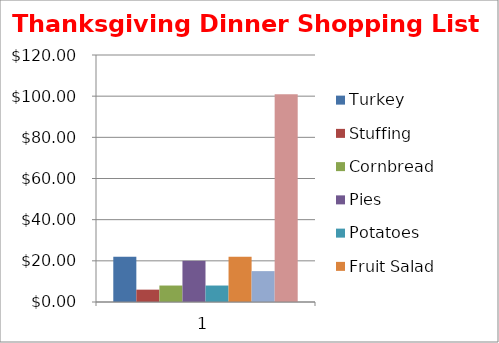
| Category | Turkey | Stuffing | Cornbread | Pies | Potatoes | Fruit Salad | French Coffee | Total Shopping Bill |
|---|---|---|---|---|---|---|---|---|
| 0 | 21.99 | 6 | 8 | 20 | 8 | 22 | 15 | 100.99 |